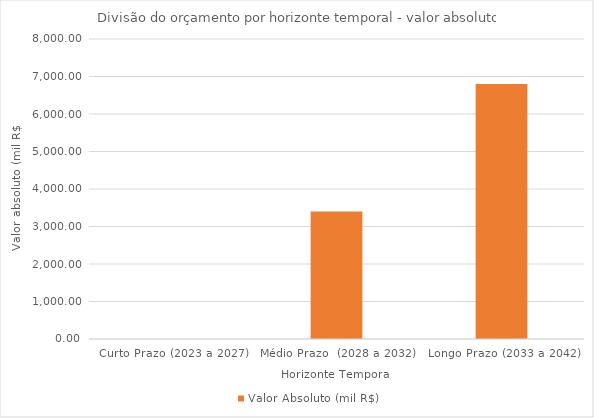
| Category | Valor Absoluto (mil R$) |
|---|---|
| Curto Prazo (2023 a 2027) | 0 |
| Médio Prazo  (2028 a 2032) | 3400 |
| Longo Prazo (2033 a 2042) | 6800 |